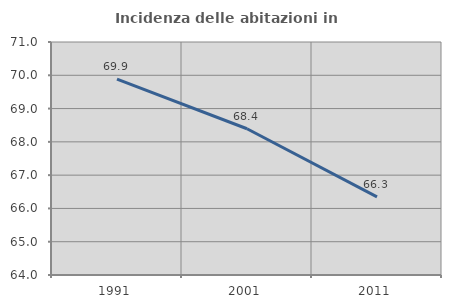
| Category | Incidenza delle abitazioni in proprietà  |
|---|---|
| 1991.0 | 69.884 |
| 2001.0 | 68.394 |
| 2011.0 | 66.347 |